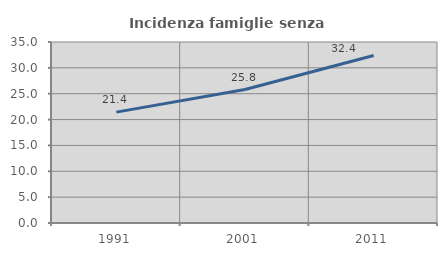
| Category | Incidenza famiglie senza nuclei |
|---|---|
| 1991.0 | 21.437 |
| 2001.0 | 25.813 |
| 2011.0 | 32.386 |